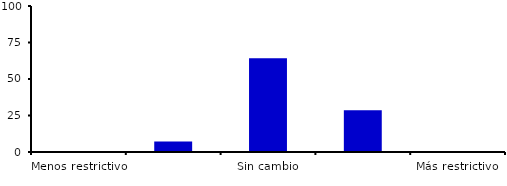
| Category | Series 0 |
|---|---|
| Menos restrictivo | 0 |
| Moderadamente menos restrictivo | 7.143 |
| Sin cambio | 64.286 |
| Moderadamente más restrictivo | 28.571 |
| Más restrictivo | 0 |